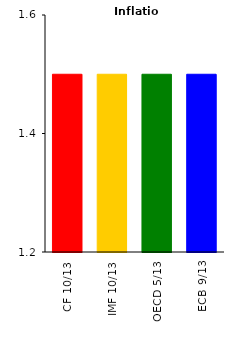
| Category | Inflation |
|---|---|
| CF 10/13 | 1.5 |
| IMF 10/13 | 1.5 |
| OECD 5/13 | 1.5 |
| ECB 9/13 | 1.5 |